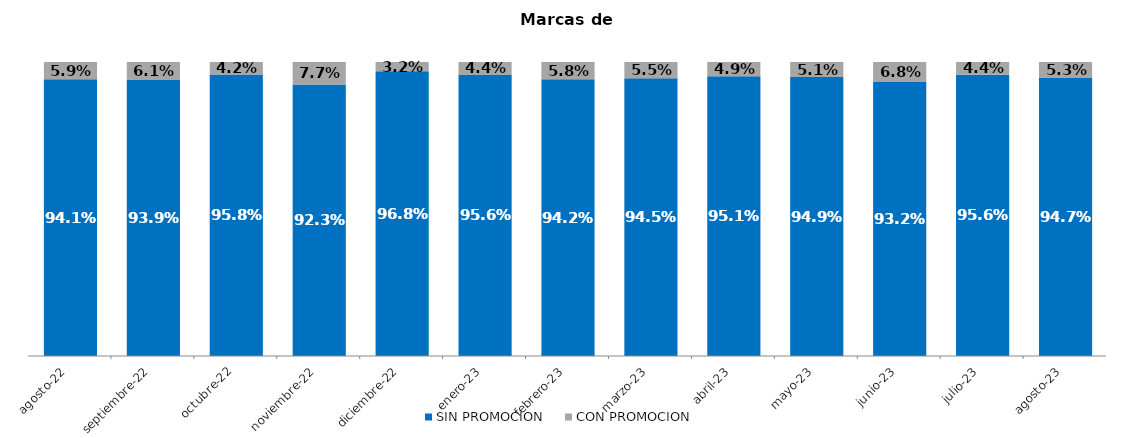
| Category | SIN PROMOCION   | CON PROMOCION   |
|---|---|---|
| 2022-08-01 | 0.941 | 0.059 |
| 2022-09-01 | 0.939 | 0.061 |
| 2022-10-01 | 0.958 | 0.042 |
| 2022-11-01 | 0.923 | 0.077 |
| 2022-12-01 | 0.968 | 0.032 |
| 2023-01-01 | 0.956 | 0.044 |
| 2023-02-01 | 0.942 | 0.058 |
| 2023-03-01 | 0.945 | 0.055 |
| 2023-04-01 | 0.951 | 0.049 |
| 2023-05-01 | 0.949 | 0.051 |
| 2023-06-01 | 0.932 | 0.068 |
| 2023-07-01 | 0.956 | 0.044 |
| 2023-08-01 | 0.947 | 0.053 |